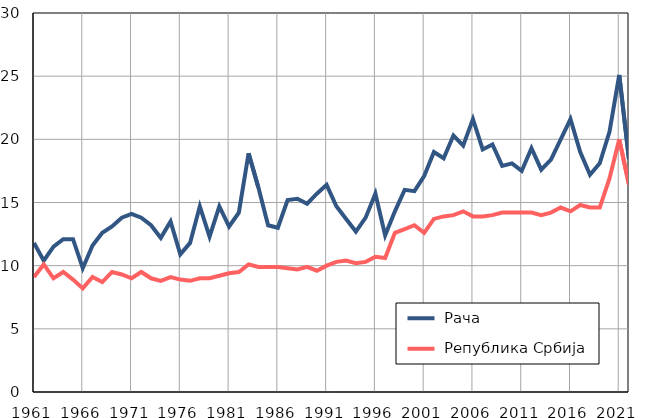
| Category |  Рача |  Република Србија |
|---|---|---|
| 1961.0 | 11.8 | 9.1 |
| 1962.0 | 10.4 | 10.1 |
| 1963.0 | 11.5 | 9 |
| 1964.0 | 12.1 | 9.5 |
| 1965.0 | 12.1 | 8.9 |
| 1966.0 | 9.8 | 8.2 |
| 1967.0 | 11.6 | 9.1 |
| 1968.0 | 12.6 | 8.7 |
| 1969.0 | 13.1 | 9.5 |
| 1970.0 | 13.8 | 9.3 |
| 1971.0 | 14.1 | 9 |
| 1972.0 | 13.8 | 9.5 |
| 1973.0 | 13.2 | 9 |
| 1974.0 | 12.2 | 8.8 |
| 1975.0 | 13.5 | 9.1 |
| 1976.0 | 10.9 | 8.9 |
| 1977.0 | 11.8 | 8.8 |
| 1978.0 | 14.7 | 9 |
| 1979.0 | 12.3 | 9 |
| 1980.0 | 14.7 | 9.2 |
| 1981.0 | 13.1 | 9.4 |
| 1982.0 | 14.2 | 9.5 |
| 1983.0 | 18.9 | 10.1 |
| 1984.0 | 16.2 | 9.9 |
| 1985.0 | 13.2 | 9.9 |
| 1986.0 | 13 | 9.9 |
| 1987.0 | 15.2 | 9.8 |
| 1988.0 | 15.3 | 9.7 |
| 1989.0 | 14.9 | 9.9 |
| 1990.0 | 15.7 | 9.6 |
| 1991.0 | 16.4 | 10 |
| 1992.0 | 14.7 | 10.3 |
| 1993.0 | 13.7 | 10.4 |
| 1994.0 | 12.7 | 10.2 |
| 1995.0 | 13.8 | 10.3 |
| 1996.0 | 15.7 | 10.7 |
| 1997.0 | 12.4 | 10.6 |
| 1998.0 | 14.3 | 12.6 |
| 1999.0 | 16 | 12.9 |
| 2000.0 | 15.9 | 13.2 |
| 2001.0 | 17.1 | 12.6 |
| 2002.0 | 19 | 13.7 |
| 2003.0 | 18.5 | 13.9 |
| 2004.0 | 20.3 | 14 |
| 2005.0 | 19.5 | 14.3 |
| 2006.0 | 21.6 | 13.9 |
| 2007.0 | 19.2 | 13.9 |
| 2008.0 | 19.6 | 14 |
| 2009.0 | 17.9 | 14.2 |
| 2010.0 | 18.1 | 14.2 |
| 2011.0 | 17.5 | 14.2 |
| 2012.0 | 19.3 | 14.2 |
| 2013.0 | 17.6 | 14 |
| 2014.0 | 18.4 | 14.2 |
| 2015.0 | 20 | 14.6 |
| 2016.0 | 21.6 | 14.3 |
| 2017.0 | 19 | 14.8 |
| 2018.0 | 17.2 | 14.6 |
| 2019.0 | 18.1 | 14.6 |
| 2020.0 | 20.6 | 16.9 |
| 2021.0 | 25.1 | 20 |
| 2022.0 | 18.4 | 16.4 |